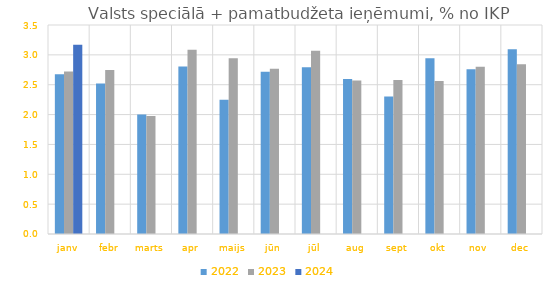
| Category | 2022 | 2023 | 2024 |
|---|---|---|---|
| janv | 2.677 | 2.722 | 3.168 |
| febr | 2.519 | 2.748 | 0 |
| marts | 2.003 | 1.974 | 0 |
| apr | 2.803 | 3.086 | 0 |
| maijs | 2.248 | 2.945 | 0 |
| jūn | 2.717 | 2.769 | 0 |
| jūl | 2.79 | 3.068 | 0 |
| aug | 2.597 | 2.57 | 0 |
| sept | 2.301 | 2.58 | 0 |
| okt | 2.944 | 2.564 | 0 |
| nov | 2.76 | 2.8 | 0 |
| dec | 3.092 | 2.841 | 0 |